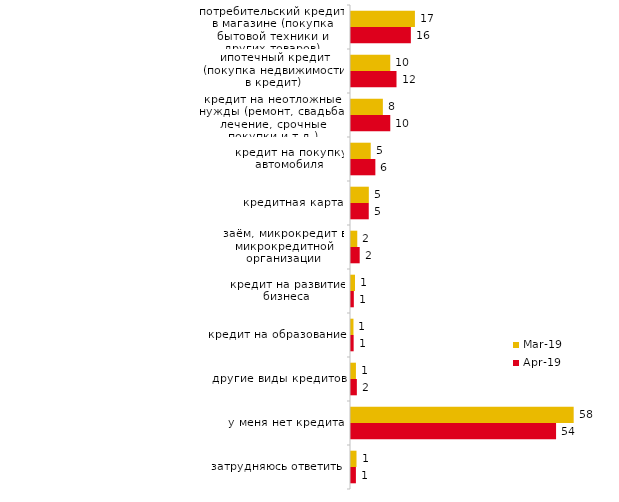
| Category | мар.19 | апр.19 |
|---|---|---|
| потребительский кредит в магазине (покупка бытовой техники и других товаров) | 16.758 | 15.693 |
| ипотечный кредит (покупка недвижимости в кредит) | 10.293 | 11.931 |
| кредит на неотложные нужды (ремонт, свадьба, лечение, срочные покупки и т.д.) | 8.354 | 10.297 |
| кредит на покупку автомобиля | 5.172 | 6.386 |
| кредитная карта | 4.674 | 4.653 |
| заём, микрокредит в микрокредитной организации | 1.641 | 2.277 |
| кредит на развитие бизнеса | 1.044 | 0.743 |
| кредит на образование | 0.646 | 0.693 |
| другие виды кредитов | 1.293 | 1.535 |
| у меня нет кредита | 58.379 | 53.762 |
| затрудняюсь ответить | 1.442 | 1.287 |